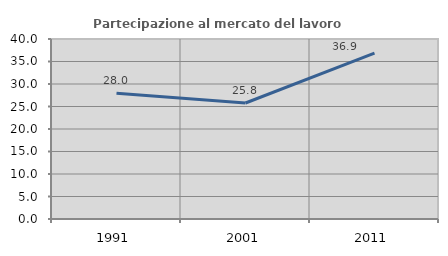
| Category | Partecipazione al mercato del lavoro  femminile |
|---|---|
| 1991.0 | 27.95 |
| 2001.0 | 25.779 |
| 2011.0 | 36.856 |